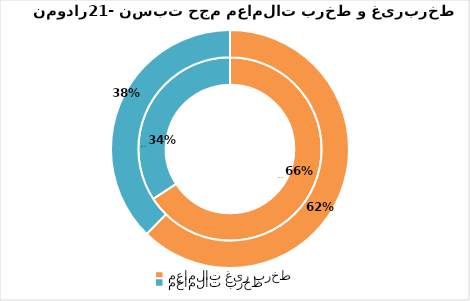
| Category | آذر 96 | دی 96 |
|---|---|---|
| معاملات غیر برخط | 20139200281 | 19921233076.5 |
| معاملات برخط | 10447202451 | 12028887741.5 |